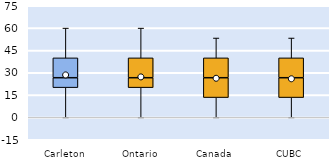
| Category | 25th | 50th | 75th |
|---|---|---|---|
| Carleton | 20 | 6.667 | 13.333 |
| Ontario | 20 | 6.667 | 13.333 |
| Canada | 13.333 | 13.333 | 13.333 |
| CUBC | 13.333 | 13.333 | 13.333 |